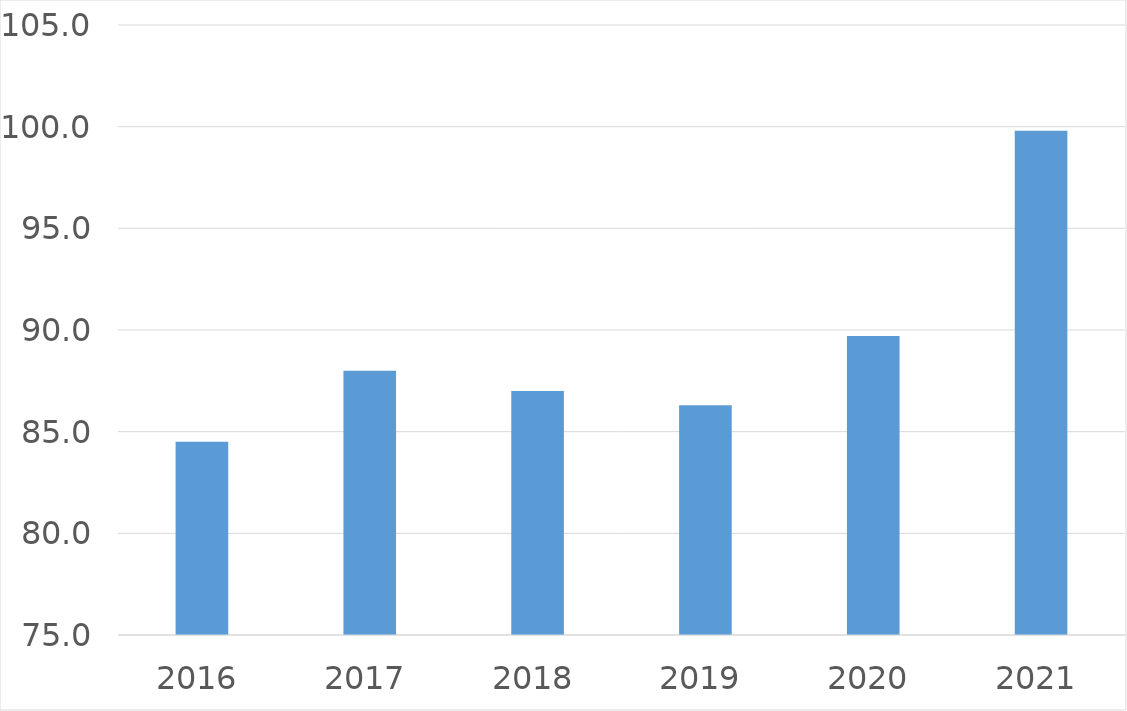
| Category | Series 0 |
|---|---|
| 2016 | 84.5 |
| 2017 | 88 |
| 2018 | 87 |
| 2019 | 86.3 |
| 2020 | 89.7 |
| 2021 | 99.8 |